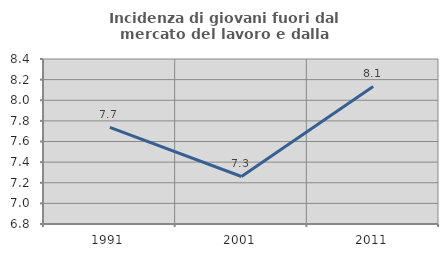
| Category | Incidenza di giovani fuori dal mercato del lavoro e dalla formazione  |
|---|---|
| 1991.0 | 7.736 |
| 2001.0 | 7.261 |
| 2011.0 | 8.133 |